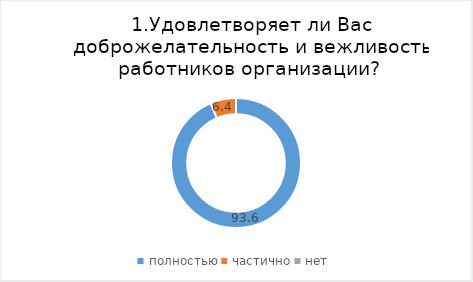
| Category | Парабельский |
|---|---|
| полностью | 93.617 |
| частично | 6.383 |
| нет | 0 |